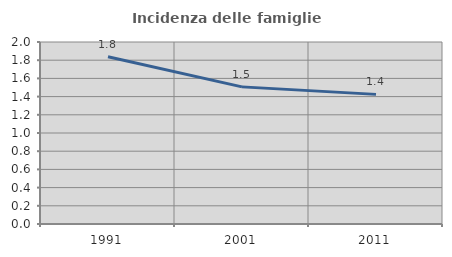
| Category | Incidenza delle famiglie numerose |
|---|---|
| 1991.0 | 1.837 |
| 2001.0 | 1.507 |
| 2011.0 | 1.424 |